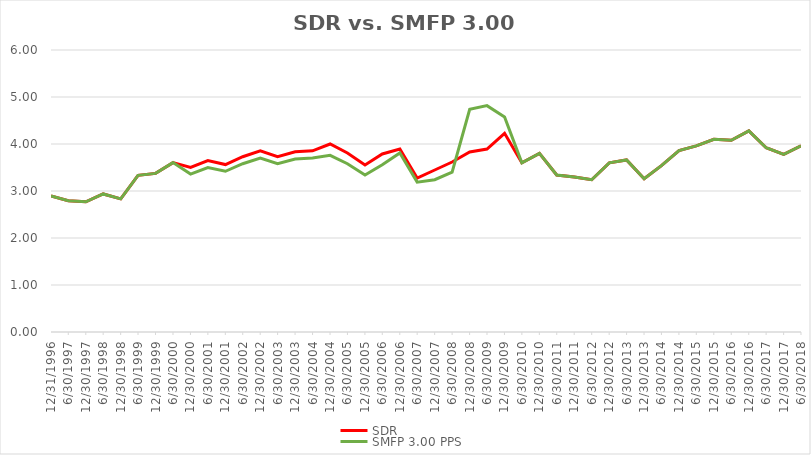
| Category | SDR | SMFP 3.00 PPS |
|---|---|---|
| 12/31/96 | 2.896 | 2.896 |
| 6/30/97 | 2.792 | 2.792 |
| 12/31/97 | 2.771 | 2.771 |
| 6/30/98 | 2.938 | 2.938 |
| 12/31/98 | 2.833 | 2.833 |
| 6/30/99 | 3.333 | 3.333 |
| 12/31/99 | 3.375 | 3.375 |
| 6/30/00 | 3.604 | 3.604 |
| 12/31/00 | 3.5 | 3.36 |
| 6/30/01 | 3.646 | 3.5 |
| 12/31/01 | 3.562 | 3.42 |
| 6/30/02 | 3.729 | 3.58 |
| 12/31/02 | 3.854 | 3.7 |
| 6/30/03 | 3.729 | 3.58 |
| 12/31/03 | 3.833 | 3.68 |
| 6/30/04 | 3.854 | 3.7 |
| 12/31/04 | 4 | 3.76 |
| 6/30/05 | 3.809 | 3.58 |
| 12/31/05 | 3.553 | 3.34 |
| 6/30/06 | 3.787 | 3.56 |
| 12/31/06 | 3.894 | 3.809 |
| 6/30/07 | 3.277 | 3.189 |
| 12/31/07 | 3.447 | 3.24 |
| 6/30/08 | 3.617 | 3.4 |
| 12/31/08 | 3.83 | 4.737 |
| 6/30/09 | 3.894 | 4.816 |
| 12/31/09 | 4.227 | 4.577 |
| 6/30/10 | 3.6 | 3.6 |
| 12/31/10 | 3.8 | 3.8 |
| 6/30/11 | 3.34 | 3.34 |
| 12/31/11 | 3.3 | 3.3 |
| 6/30/12 | 3.24 | 3.24 |
| 12/31/12 | 3.6 | 3.6 |
| 6/30/13 | 3.66 | 3.66 |
| 12/31/13 | 3.26 | 3.26 |
| 6/30/14 | 3.54 | 3.54 |
| 12/31/14 | 3.86 | 3.86 |
| 6/30/15 | 3.96 | 3.96 |
| 12/31/15 | 4.1 | 4.1 |
| 6/30/16 | 4.08 | 4.08 |
| 12/31/16 | 4.28 | 4.28 |
| 6/30/17 | 3.92 | 3.92 |
| 12/31/17 | 3.78 | 3.78 |
| 6/30/18 | 3.96 | 3.96 |